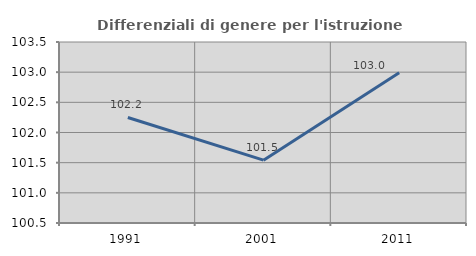
| Category | Differenziali di genere per l'istruzione superiore |
|---|---|
| 1991.0 | 102.249 |
| 2001.0 | 101.541 |
| 2011.0 | 102.989 |